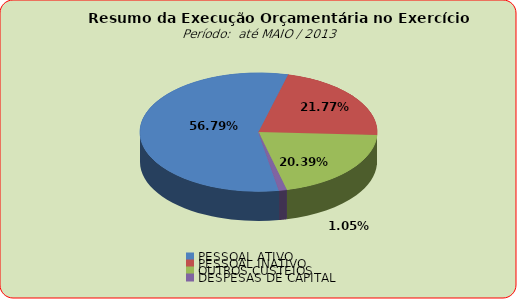
| Category | Series 0 |
|---|---|
| PESSOAL ATIVO | 38356214.57 |
| PESSOAL INATIVO | 14703157.64 |
| OUTROS CUSTEIOS | 13767894.96 |
| DESPESAS DE CAPITAL | 709343.41 |